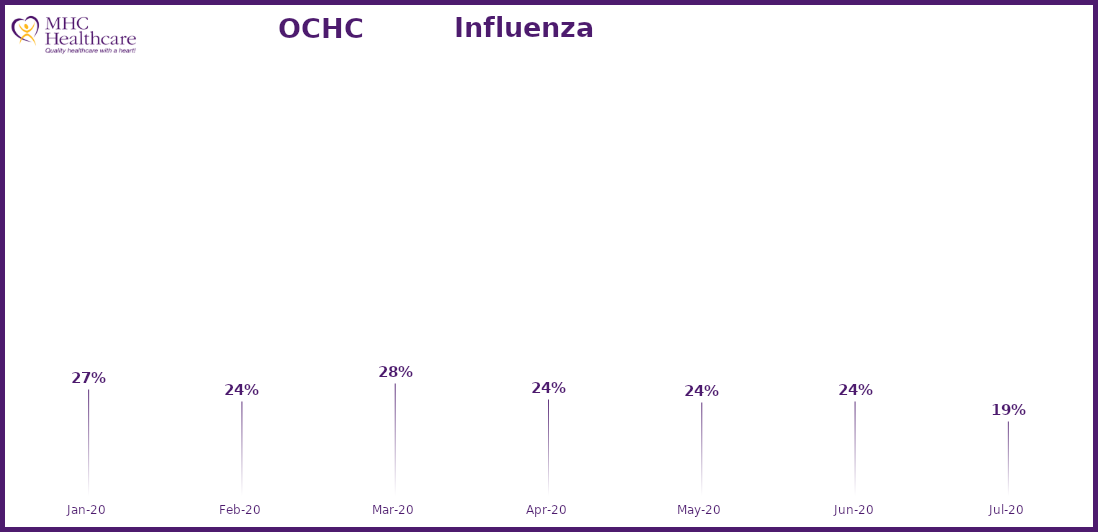
| Category | Online Access to Health Information |
|---|---|
| 2020-01-01 | 0.265 |
| 2020-02-01 | 0.238 |
| 2020-03-01 | 0.279 |
| 2020-04-01 | 0.244 |
| 2020-05-01 | 0.236 |
| 2020-06-01 | 0.239 |
| 2020-07-01 | 0.194 |